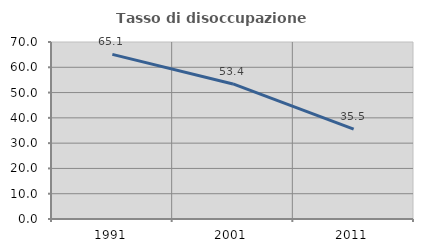
| Category | Tasso di disoccupazione giovanile  |
|---|---|
| 1991.0 | 65.116 |
| 2001.0 | 53.409 |
| 2011.0 | 35.526 |